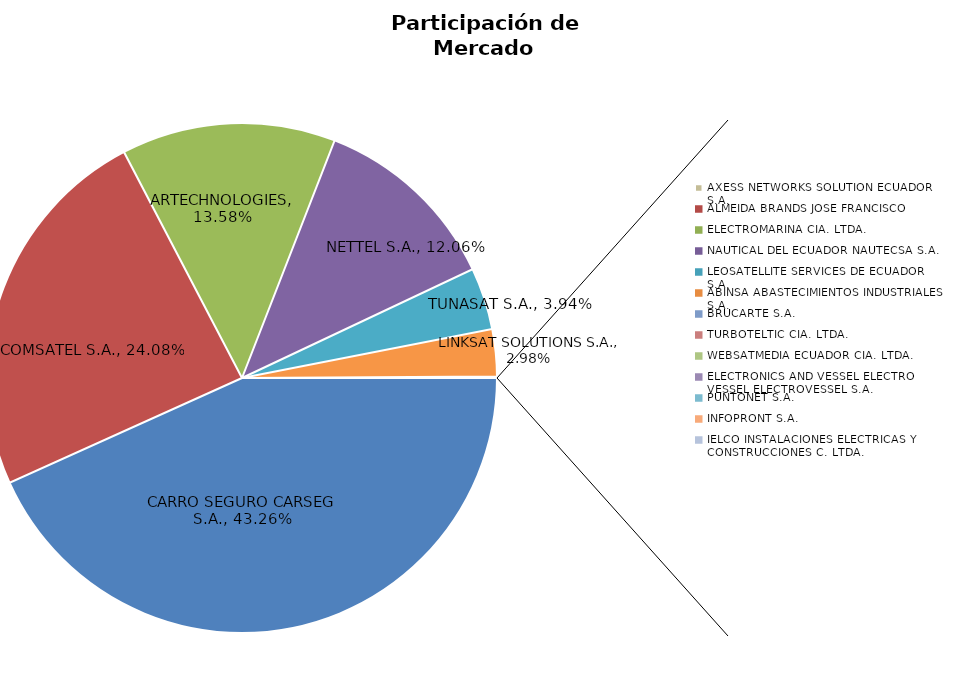
| Category | Series 0 |
|---|---|
| CARRO SEGURO CARSEG S.A. | 0.433 |
| COMSATEL S.A. | 0.241 |
| ARTECHNOLOGIES | 0.136 |
| NETTEL S.A. | 0.121 |
| TUNASAT S.A. | 0.039 |
| LINKSAT SOLUTIONS S.A. | 0.03 |
| AXESS NETWORKS SOLUTION ECUADOR S.A. | 0.001 |
| ALMEIDA BRANDS JOSE FRANCISCO | 0 |
| ELECTROMARINA CIA. LTDA. | 0 |
| NAUTICAL DEL ECUADOR NAUTECSA S.A. | 0 |
| LEOSATELLITE SERVICES DE ECUADOR S.A. | 0 |
| ABINSA ABASTECIMIENTOS INDUSTRIALES S.A. | 0 |
| BRUCARTE S.A. | 0 |
| TURBOTELTIC CIA. LTDA. | 0 |
| WEBSATMEDIA ECUADOR CIA. LTDA. | 0 |
| ELECTRONICS AND VESSEL ELECTRO VESSEL ELECTROVESSEL S.A. | 0 |
| PUNTONET S.A. | 0 |
| INFOPRONT S.A. | 0 |
| IELCO INSTALACIONES ELECTRICAS Y CONSTRUCCIONES C. LTDA. | 0 |